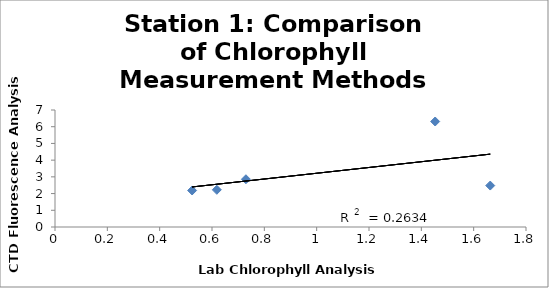
| Category | Series 0 |
|---|---|
| 1.6633212065343477 | 2.48 |
| 1.4529058735287999 | 6.312 |
| 0.7296531699660052 | 2.858 |
| 0.6184450662102214 | 2.225 |
| 0.5240381867628656 | 2.185 |